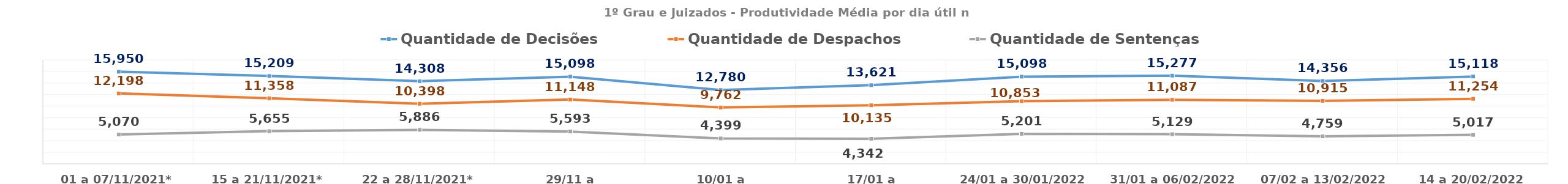
| Category | Quantidade de Decisões | Quantidade de Despachos | Quantidade de Sentenças |
|---|---|---|---|
| 01 a 07/11/2021* | 15950.333 | 12197.667 | 5070 |
| 15 a 21/11/2021* | 15209.25 | 11358.25 | 5654.75 |
| 22 a 28/11/2021* | 14308.2 | 10398 | 5886.4 |
| 29/11 a 05/12/2021* | 15097.6 | 11147.8 | 5593.4 |
| 10/01 a 16/01/2022* | 12780.4 | 9761.8 | 4399 |
| 17/01 a 23/01/2022* | 13621 | 10135 | 4341.8 |
| 24/01 a 30/01/2022 | 15098 | 10852.8 | 5200.8 |
| 31/01 a 06/02/2022 | 15277 | 11087.2 | 5128.6 |
| 07/02 a 13/02/2022 | 14355.8 | 10915 | 4758.8 |
| 14 a 20/02/2022 | 15118.4 | 11254 | 5016.6 |